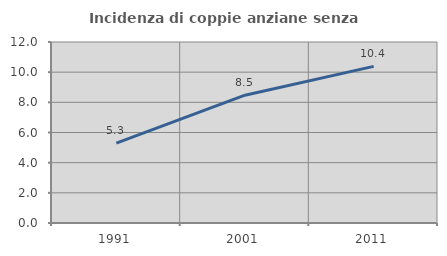
| Category | Incidenza di coppie anziane senza figli  |
|---|---|
| 1991.0 | 5.293 |
| 2001.0 | 8.475 |
| 2011.0 | 10.386 |